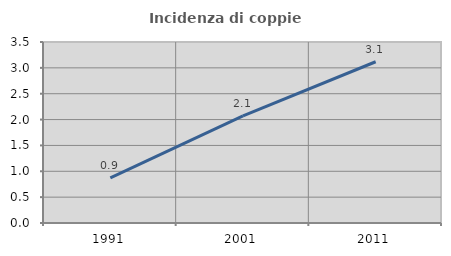
| Category | Incidenza di coppie miste |
|---|---|
| 1991.0 | 0.872 |
| 2001.0 | 2.073 |
| 2011.0 | 3.118 |